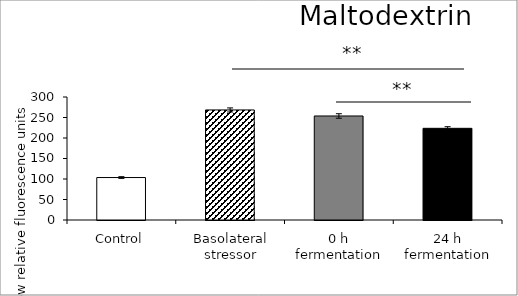
| Category | average |
|---|---|
| Control | 103.561 |
| Basolateral stressor | 268.424 |
| 0 h fermentation | 253.706 |
| 24 h fermentation | 223.624 |